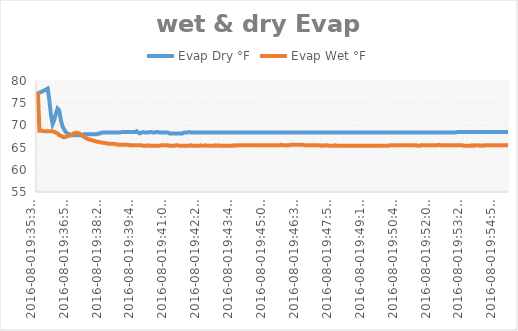
| Category | Evap Dry °F | Evap Wet °F |
|---|---|---|
| 2016-08-019:35:35 PM | 77 | 77.675 |
| 2016-08-019:35:39 PM | 77.4 | 68.788 |
| 2016-08-019:35:43 PM | 77.5 | 68.788 |
| 2016-08-019:35:47 PM | 77.7 | 68.788 |
| 2016-08-019:35:51 PM | 77.9 | 68.675 |
| 2016-08-019:35:55 PM | 78.1 | 68.675 |
| 2016-08-019:35:59 PM | 78.3 | 68.675 |
| 2016-08-019:36:04 PM | 75.7 | 68.675 |
| 2016-08-019:36:08 PM | 72.3 | 68.675 |
| 2016-08-019:36:12 PM | 70.3 | 68.675 |
| 2016-08-019:36:16 PM | 71.2 | 68.562 |
| 2016-08-019:36:20 PM | 72.7 | 68.338 |
| 2016-08-019:36:24 PM | 73.8 | 68.225 |
| 2016-08-019:36:29 PM | 73.4 | 67.775 |
| 2016-08-019:36:33 PM | 71.2 | 67.662 |
| 2016-08-019:36:37 PM | 69.8 | 67.438 |
| 2016-08-019:36:41 PM | 69.1 | 67.325 |
| 2016-08-019:36:45 PM | 68.5 | 67.438 |
| 2016-08-019:36:49 PM | 68.2 | 67.55 |
| 2016-08-019:36:54 PM | 68 | 67.662 |
| 2016-08-019:36:58 PM | 67.8 | 67.888 |
| 2016-08-019:37:02 PM | 67.8 | 68 |
| 2016-08-019:37:06 PM | 67.8 | 68.225 |
| 2016-08-019:37:10 PM | 67.8 | 68.338 |
| 2016-08-019:37:14 PM | 67.8 | 68.338 |
| 2016-08-019:37:19 PM | 67.8 | 68.225 |
| 2016-08-019:37:23 PM | 67.8 | 68 |
| 2016-08-019:37:27 PM | 67.8 | 67.662 |
| 2016-08-019:37:31 PM | 68 | 67.438 |
| 2016-08-019:37:35 PM | 68 | 67.212 |
| 2016-08-019:37:39 PM | 68 | 66.988 |
| 2016-08-019:37:44 PM | 68 | 66.875 |
| 2016-08-019:37:48 PM | 68 | 66.762 |
| 2016-08-019:37:52 PM | 68 | 66.65 |
| 2016-08-019:37:56 PM | 68 | 66.538 |
| 2016-08-019:38:00 PM | 68 | 66.425 |
| 2016-08-019:38:04 PM | 68 | 66.312 |
| 2016-08-019:38:08 PM | 68.2 | 66.312 |
| 2016-08-019:38:13 PM | 68.2 | 66.2 |
| 2016-08-019:38:17 PM | 68.4 | 66.088 |
| 2016-08-019:38:21 PM | 68.4 | 66.088 |
| 2016-08-019:38:25 PM | 68.4 | 65.975 |
| 2016-08-019:38:29 PM | 68.4 | 65.975 |
| 2016-08-019:38:33 PM | 68.4 | 65.862 |
| 2016-08-019:38:37 PM | 68.4 | 65.862 |
| 2016-08-019:38:41 PM | 68.4 | 65.862 |
| 2016-08-019:38:46 PM | 68.4 | 65.862 |
| 2016-08-019:38:50 PM | 68.4 | 65.75 |
| 2016-08-019:38:54 PM | 68.4 | 65.75 |
| 2016-08-019:38:58 PM | 68.4 | 65.638 |
| 2016-08-019:39:02 PM | 68.4 | 65.638 |
| 2016-08-019:39:06 PM | 68.5 | 65.638 |
| 2016-08-019:39:10 PM | 68.5 | 65.638 |
| 2016-08-019:39:14 PM | 68.5 | 65.638 |
| 2016-08-019:39:18 PM | 68.5 | 65.638 |
| 2016-08-019:39:22 PM | 68.5 | 65.638 |
| 2016-08-019:39:26 PM | 68.5 | 65.525 |
| 2016-08-019:39:30 PM | 68.5 | 65.525 |
| 2016-08-019:39:34 PM | 68.5 | 65.525 |
| 2016-08-019:39:38 PM | 68.5 | 65.525 |
| 2016-08-019:39:42 PM | 68.7 | 65.525 |
| 2016-08-019:39:47 PM | 68.4 | 65.525 |
| 2016-08-019:39:51 PM | 68.2 | 65.525 |
| 2016-08-019:39:55 PM | 68.4 | 65.525 |
| 2016-08-019:39:59 PM | 68.5 | 65.412 |
| 2016-08-019:40:03 PM | 68.4 | 65.412 |
| 2016-08-019:40:07 PM | 68.4 | 65.412 |
| 2016-08-019:40:11 PM | 68.4 | 65.525 |
| 2016-08-019:40:15 PM | 68.5 | 65.412 |
| 2016-08-019:40:19 PM | 68.5 | 65.412 |
| 2016-08-019:40:23 PM | 68.4 | 65.412 |
| 2016-08-019:40:27 PM | 68.4 | 65.412 |
| 2016-08-019:40:31 PM | 68.5 | 65.412 |
| 2016-08-019:40:35 PM | 68.5 | 65.412 |
| 2016-08-019:40:39 PM | 68.4 | 65.412 |
| 2016-08-019:40:43 PM | 68.4 | 65.525 |
| 2016-08-019:40:47 PM | 68.4 | 65.525 |
| 2016-08-019:40:51 PM | 68.4 | 65.525 |
| 2016-08-019:40:55 PM | 68.4 | 65.525 |
| 2016-08-019:41:00 PM | 68.4 | 65.525 |
| 2016-08-019:41:04 PM | 68.2 | 65.412 |
| 2016-08-019:41:08 PM | 68.2 | 65.412 |
| 2016-08-019:41:12 PM | 68.2 | 65.412 |
| 2016-08-019:41:16 PM | 68.2 | 65.412 |
| 2016-08-019:41:20 PM | 68.2 | 65.525 |
| 2016-08-019:41:24 PM | 68.2 | 65.525 |
| 2016-08-019:41:28 PM | 68.2 | 65.412 |
| 2016-08-019:41:32 PM | 68.2 | 65.412 |
| 2016-08-019:41:36 PM | 68.2 | 65.412 |
| 2016-08-019:41:40 PM | 68.4 | 65.412 |
| 2016-08-019:41:44 PM | 68.4 | 65.412 |
| 2016-08-019:41:48 PM | 68.4 | 65.412 |
| 2016-08-019:41:52 PM | 68.5 | 65.412 |
| 2016-08-019:41:56 PM | 68.4 | 65.525 |
| 2016-08-019:42:00 PM | 68.4 | 65.412 |
| 2016-08-019:42:04 PM | 68.4 | 65.412 |
| 2016-08-019:42:08 PM | 68.4 | 65.412 |
| 2016-08-019:42:12 PM | 68.4 | 65.412 |
| 2016-08-019:42:16 PM | 68.4 | 65.412 |
| 2016-08-019:42:20 PM | 68.4 | 65.525 |
| 2016-08-019:42:24 PM | 68.4 | 65.412 |
| 2016-08-019:42:28 PM | 68.4 | 65.412 |
| 2016-08-019:42:33 PM | 68.4 | 65.525 |
| 2016-08-019:42:37 PM | 68.4 | 65.412 |
| 2016-08-019:42:41 PM | 68.4 | 65.412 |
| 2016-08-019:42:45 PM | 68.4 | 65.412 |
| 2016-08-019:42:49 PM | 68.4 | 65.412 |
| 2016-08-019:42:53 PM | 68.4 | 65.412 |
| 2016-08-019:42:57 PM | 68.4 | 65.525 |
| 2016-08-019:43:01 PM | 68.4 | 65.412 |
| 2016-08-019:43:05 PM | 68.4 | 65.525 |
| 2016-08-019:43:09 PM | 68.4 | 65.412 |
| 2016-08-019:43:13 PM | 68.4 | 65.412 |
| 2016-08-019:43:17 PM | 68.4 | 65.412 |
| 2016-08-019:43:21 PM | 68.4 | 65.412 |
| 2016-08-019:43:25 PM | 68.4 | 65.412 |
| 2016-08-019:43:29 PM | 68.4 | 65.412 |
| 2016-08-019:43:33 PM | 68.4 | 65.412 |
| 2016-08-019:43:38 PM | 68.4 | 65.412 |
| 2016-08-019:43:42 PM | 68.4 | 65.525 |
| 2016-08-019:43:46 PM | 68.4 | 65.412 |
| 2016-08-019:43:50 PM | 68.4 | 65.525 |
| 2016-08-019:43:54 PM | 68.4 | 65.525 |
| 2016-08-019:43:58 PM | 68.4 | 65.525 |
| 2016-08-019:44:03 PM | 68.4 | 65.525 |
| 2016-08-019:44:07 PM | 68.4 | 65.525 |
| 2016-08-019:44:11 PM | 68.4 | 65.525 |
| 2016-08-019:44:15 PM | 68.4 | 65.525 |
| 2016-08-019:44:19 PM | 68.4 | 65.525 |
| 2016-08-019:44:23 PM | 68.4 | 65.525 |
| 2016-08-019:44:28 PM | 68.4 | 65.525 |
| 2016-08-019:44:32 PM | 68.4 | 65.525 |
| 2016-08-019:44:36 PM | 68.4 | 65.525 |
| 2016-08-019:44:40 PM | 68.4 | 65.525 |
| 2016-08-019:44:44 PM | 68.4 | 65.525 |
| 2016-08-019:44:48 PM | 68.4 | 65.525 |
| 2016-08-019:44:53 PM | 68.4 | 65.525 |
| 2016-08-019:44:57 PM | 68.4 | 65.525 |
| 2016-08-019:45:01 PM | 68.4 | 65.525 |
| 2016-08-019:45:05 PM | 68.4 | 65.525 |
| 2016-08-019:45:09 PM | 68.4 | 65.525 |
| 2016-08-019:45:13 PM | 68.4 | 65.525 |
| 2016-08-019:45:18 PM | 68.4 | 65.525 |
| 2016-08-019:45:22 PM | 68.4 | 65.525 |
| 2016-08-019:45:26 PM | 68.4 | 65.525 |
| 2016-08-019:45:30 PM | 68.4 | 65.525 |
| 2016-08-019:45:34 PM | 68.4 | 65.525 |
| 2016-08-019:45:38 PM | 68.4 | 65.525 |
| 2016-08-019:45:43 PM | 68.4 | 65.638 |
| 2016-08-019:45:47 PM | 68.4 | 65.525 |
| 2016-08-019:45:51 PM | 68.4 | 65.525 |
| 2016-08-019:45:55 PM | 68.4 | 65.525 |
| 2016-08-019:45:59 PM | 68.4 | 65.525 |
| 2016-08-019:46:03 PM | 68.4 | 65.525 |
| 2016-08-019:46:07 PM | 68.4 | 65.638 |
| 2016-08-019:46:12 PM | 68.4 | 65.638 |
| 2016-08-019:46:16 PM | 68.4 | 65.638 |
| 2016-08-019:46:20 PM | 68.4 | 65.638 |
| 2016-08-019:46:24 PM | 68.4 | 65.638 |
| 2016-08-019:46:28 PM | 68.4 | 65.638 |
| 2016-08-019:46:32 PM | 68.4 | 65.638 |
| 2016-08-019:46:37 PM | 68.4 | 65.638 |
| 2016-08-019:46:41 PM | 68.4 | 65.525 |
| 2016-08-019:46:45 PM | 68.4 | 65.525 |
| 2016-08-019:46:49 PM | 68.4 | 65.525 |
| 2016-08-019:46:53 PM | 68.4 | 65.525 |
| 2016-08-019:46:57 PM | 68.4 | 65.525 |
| 2016-08-019:47:02 PM | 68.4 | 65.525 |
| 2016-08-019:47:06 PM | 68.4 | 65.525 |
| 2016-08-019:47:10 PM | 68.4 | 65.525 |
| 2016-08-019:47:14 PM | 68.4 | 65.525 |
| 2016-08-019:47:18 PM | 68.4 | 65.525 |
| 2016-08-019:47:22 PM | 68.4 | 65.412 |
| 2016-08-019:47:26 PM | 68.4 | 65.525 |
| 2016-08-019:47:31 PM | 68.4 | 65.412 |
| 2016-08-019:47:35 PM | 68.4 | 65.525 |
| 2016-08-019:47:39 PM | 68.4 | 65.525 |
| 2016-08-019:47:43 PM | 68.4 | 65.412 |
| 2016-08-019:47:47 PM | 68.4 | 65.412 |
| 2016-08-019:47:51 PM | 68.4 | 65.412 |
| 2016-08-019:47:56 PM | 68.4 | 65.412 |
| 2016-08-019:48:00 PM | 68.4 | 65.525 |
| 2016-08-019:48:04 PM | 68.4 | 65.412 |
| 2016-08-019:48:08 PM | 68.4 | 65.412 |
| 2016-08-019:48:12 PM | 68.4 | 65.412 |
| 2016-08-019:48:16 PM | 68.4 | 65.412 |
| 2016-08-019:48:21 PM | 68.4 | 65.412 |
| 2016-08-019:48:25 PM | 68.4 | 65.412 |
| 2016-08-019:48:29 PM | 68.4 | 65.412 |
| 2016-08-019:48:33 PM | 68.4 | 65.412 |
| 2016-08-019:48:37 PM | 68.4 | 65.412 |
| 2016-08-019:48:41 PM | 68.4 | 65.412 |
| 2016-08-019:48:45 PM | 68.4 | 65.412 |
| 2016-08-019:48:50 PM | 68.4 | 65.412 |
| 2016-08-019:48:54 PM | 68.4 | 65.412 |
| 2016-08-019:48:58 PM | 68.4 | 65.412 |
| 2016-08-019:49:02 PM | 68.4 | 65.412 |
| 2016-08-019:49:06 PM | 68.4 | 65.412 |
| 2016-08-019:49:10 PM | 68.4 | 65.412 |
| 2016-08-019:49:15 PM | 68.4 | 65.412 |
| 2016-08-019:49:19 PM | 68.4 | 65.412 |
| 2016-08-019:49:23 PM | 68.4 | 65.412 |
| 2016-08-019:49:27 PM | 68.4 | 65.412 |
| 2016-08-019:49:31 PM | 68.4 | 65.412 |
| 2016-08-019:49:35 PM | 68.4 | 65.412 |
| 2016-08-019:49:39 PM | 68.4 | 65.412 |
| 2016-08-019:49:44 PM | 68.4 | 65.412 |
| 2016-08-019:49:48 PM | 68.4 | 65.412 |
| 2016-08-019:49:52 PM | 68.4 | 65.412 |
| 2016-08-019:49:56 PM | 68.4 | 65.412 |
| 2016-08-019:50:00 PM | 68.4 | 65.412 |
| 2016-08-019:50:04 PM | 68.4 | 65.412 |
| 2016-08-019:50:08 PM | 68.4 | 65.412 |
| 2016-08-019:50:13 PM | 68.4 | 65.412 |
| 2016-08-019:50:17 PM | 68.4 | 65.525 |
| 2016-08-019:50:21 PM | 68.4 | 65.525 |
| 2016-08-019:50:25 PM | 68.4 | 65.525 |
| 2016-08-019:50:29 PM | 68.4 | 65.525 |
| 2016-08-019:50:33 PM | 68.4 | 65.525 |
| 2016-08-019:50:37 PM | 68.4 | 65.525 |
| 2016-08-019:50:42 PM | 68.4 | 65.525 |
| 2016-08-019:50:46 PM | 68.4 | 65.525 |
| 2016-08-019:50:50 PM | 68.4 | 65.525 |
| 2016-08-019:50:54 PM | 68.4 | 65.525 |
| 2016-08-019:50:58 PM | 68.4 | 65.525 |
| 2016-08-019:51:02 PM | 68.4 | 65.525 |
| 2016-08-019:51:07 PM | 68.4 | 65.525 |
| 2016-08-019:51:11 PM | 68.4 | 65.525 |
| 2016-08-019:51:15 PM | 68.4 | 65.525 |
| 2016-08-019:51:19 PM | 68.4 | 65.525 |
| 2016-08-019:51:23 PM | 68.4 | 65.525 |
| 2016-08-019:51:27 PM | 68.4 | 65.412 |
| 2016-08-019:51:31 PM | 68.4 | 65.412 |
| 2016-08-019:51:35 PM | 68.4 | 65.525 |
| 2016-08-019:51:40 PM | 68.4 | 65.525 |
| 2016-08-019:51:44 PM | 68.4 | 65.525 |
| 2016-08-019:51:48 PM | 68.4 | 65.525 |
| 2016-08-019:51:52 PM | 68.4 | 65.525 |
| 2016-08-019:51:56 PM | 68.4 | 65.525 |
| 2016-08-019:52:00 PM | 68.4 | 65.525 |
| 2016-08-019:52:05 PM | 68.4 | 65.525 |
| 2016-08-019:52:09 PM | 68.4 | 65.525 |
| 2016-08-019:52:13 PM | 68.4 | 65.525 |
| 2016-08-019:52:17 PM | 68.4 | 65.525 |
| 2016-08-019:52:21 PM | 68.4 | 65.638 |
| 2016-08-019:52:25 PM | 68.4 | 65.525 |
| 2016-08-019:52:29 PM | 68.4 | 65.525 |
| 2016-08-019:52:33 PM | 68.4 | 65.525 |
| 2016-08-019:52:38 PM | 68.4 | 65.525 |
| 2016-08-019:52:42 PM | 68.4 | 65.525 |
| 2016-08-019:52:46 PM | 68.4 | 65.525 |
| 2016-08-019:52:50 PM | 68.4 | 65.525 |
| 2016-08-019:52:54 PM | 68.4 | 65.525 |
| 2016-08-019:52:58 PM | 68.4 | 65.525 |
| 2016-08-019:53:02 PM | 68.4 | 65.525 |
| 2016-08-019:53:07 PM | 68.5 | 65.525 |
| 2016-08-019:53:11 PM | 68.5 | 65.525 |
| 2016-08-019:53:15 PM | 68.5 | 65.525 |
| 2016-08-019:53:19 PM | 68.5 | 65.525 |
| 2016-08-019:53:23 PM | 68.5 | 65.412 |
| 2016-08-019:53:27 PM | 68.5 | 65.412 |
| 2016-08-019:53:31 PM | 68.5 | 65.412 |
| 2016-08-019:53:36 PM | 68.5 | 65.412 |
| 2016-08-019:53:40 PM | 68.5 | 65.412 |
| 2016-08-019:53:44 PM | 68.5 | 65.525 |
| 2016-08-019:53:48 PM | 68.5 | 65.412 |
| 2016-08-019:53:52 PM | 68.5 | 65.525 |
| 2016-08-019:53:56 PM | 68.5 | 65.525 |
| 2016-08-019:54:01 PM | 68.5 | 65.525 |
| 2016-08-019:54:05 PM | 68.5 | 65.412 |
| 2016-08-019:54:09 PM | 68.5 | 65.525 |
| 2016-08-019:54:13 PM | 68.5 | 65.412 |
| 2016-08-019:54:17 PM | 68.5 | 65.525 |
| 2016-08-019:54:21 PM | 68.5 | 65.525 |
| 2016-08-019:54:26 PM | 68.5 | 65.525 |
| 2016-08-019:54:30 PM | 68.5 | 65.525 |
| 2016-08-019:54:34 PM | 68.5 | 65.525 |
| 2016-08-019:54:38 PM | 68.5 | 65.525 |
| 2016-08-019:54:42 PM | 68.5 | 65.525 |
| 2016-08-019:54:46 PM | 68.5 | 65.525 |
| 2016-08-019:54:50 PM | 68.5 | 65.525 |
| 2016-08-019:54:55 PM | 68.5 | 65.525 |
| 2016-08-019:54:59 PM | 68.5 | 65.525 |
| 2016-08-019:55:03 PM | 68.5 | 65.525 |
| 2016-08-019:55:07 PM | 68.5 | 65.525 |
| 2016-08-019:55:11 PM | 68.5 | 65.525 |
| 2016-08-019:55:15 PM | 68.5 | 65.525 |